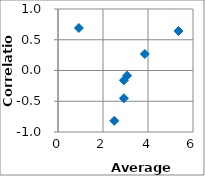
| Category | Correlation |
|---|---|
| 5.357142857142857 | 0.642 |
| 3.857142857142857 | 0.269 |
| 2.9285714285714284 | -0.451 |
| 2.5 | -0.818 |
| 2.9285714285714284 | -0.16 |
| 0.9285714285714286 | 0.691 |
| 3.0714285714285716 | -0.084 |